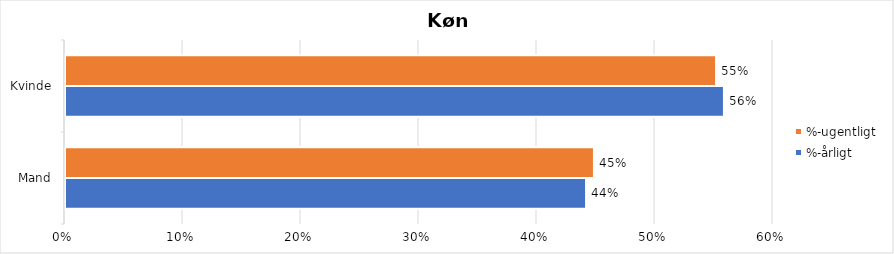
| Category | %-årligt | %-ugentligt |
|---|---|---|
| Mand | 0.442 | 0.448 |
| Kvinde | 0.558 | 0.552 |